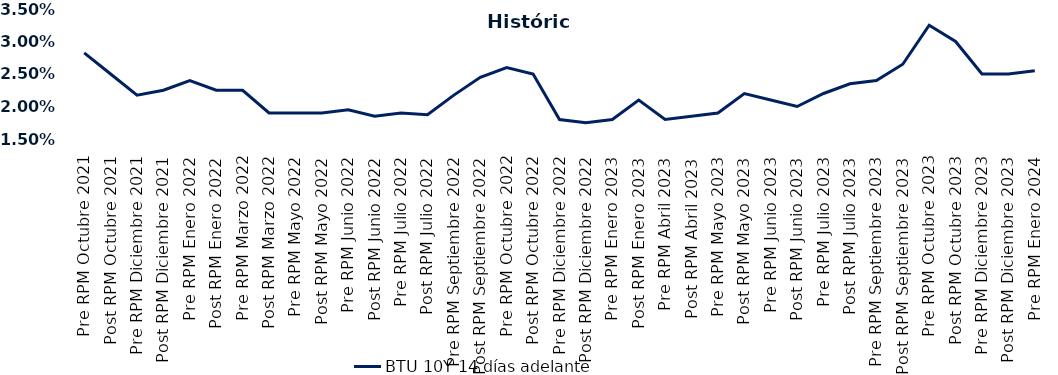
| Category | BTU 10Y 14 días adelante |
|---|---|
| Pre RPM Octubre 2021 | 0.028 |
| Post RPM Octubre 2021 | 0.025 |
| Pre RPM Diciembre 2021 | 0.022 |
| Post RPM Diciembre 2021 | 0.022 |
| Pre RPM Enero 2022 | 0.024 |
| Post RPM Enero 2022 | 0.022 |
| Pre RPM Marzo 2022 | 0.022 |
| Post RPM Marzo 2022 | 0.019 |
| Pre RPM Mayo 2022 | 0.019 |
| Post RPM Mayo 2022 | 0.019 |
| Pre RPM Junio 2022 | 0.02 |
| Post RPM Junio 2022 | 0.018 |
| Pre RPM Julio 2022 | 0.019 |
| Post RPM Julio 2022 | 0.019 |
| Pre RPM Septiembre 2022 | 0.022 |
| Post RPM Septiembre 2022 | 0.024 |
| Pre RPM Octubre 2022 | 0.026 |
| Post RPM Octubre 2022 | 0.025 |
| Pre RPM Diciembre 2022 | 0.018 |
| Post RPM Diciembre 2022 | 0.018 |
| Pre RPM Enero 2023 | 0.018 |
| Post RPM Enero 2023 | 0.021 |
| Pre RPM Abril 2023 | 0.018 |
| Post RPM Abril 2023 | 0.018 |
| Pre RPM Mayo 2023 | 0.019 |
| Post RPM Mayo 2023 | 0.022 |
| Pre RPM Junio 2023 | 0.021 |
| Post RPM Junio 2023 | 0.02 |
| Pre RPM Julio 2023 | 0.022 |
| Post RPM Julio 2023 | 0.024 |
| Pre RPM Septiembre 2023 | 0.024 |
| Post RPM Septiembre 2023 | 0.026 |
| Pre RPM Octubre 2023 | 0.032 |
| Post RPM Octubre 2023 | 0.03 |
| Pre RPM Diciembre 2023 | 0.025 |
| Post RPM Diciembre 2023 | 0.025 |
| Pre RPM Enero 2024 | 0.026 |